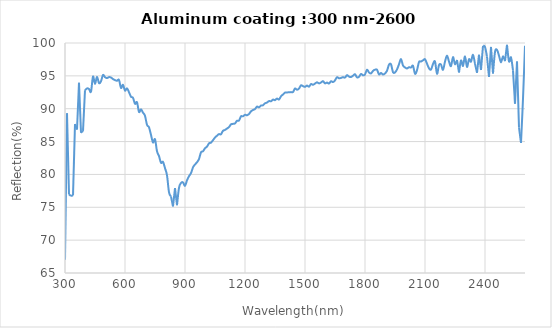
| Category | Reflection(%) |
|---|---|
| 2600.0 | 99.563 |
| 2590.0 | 91.52 |
| 2580.0 | 84.785 |
| 2570.0 | 87.147 |
| 2560.0 | 97.187 |
| 2550.0 | 90.767 |
| 2540.0 | 95.826 |
| 2530.0 | 97.818 |
| 2520.0 | 97.189 |
| 2510.0 | 99.725 |
| 2500.0 | 97.246 |
| 2490.0 | 97.972 |
| 2480.0 | 97.061 |
| 2470.0 | 98.062 |
| 2460.0 | 98.961 |
| 2450.0 | 98.632 |
| 2440.0 | 95.357 |
| 2430.0 | 99.401 |
| 2420.0 | 94.836 |
| 2410.0 | 97.933 |
| 2400.0 | 99.411 |
| 2390.0 | 99.559 |
| 2380.0 | 95.885 |
| 2370.0 | 98.211 |
| 2360.0 | 95.468 |
| 2350.0 | 96.833 |
| 2340.0 | 98.203 |
| 2330.0 | 97.158 |
| 2320.0 | 97.538 |
| 2310.0 | 96.358 |
| 2300.0 | 97.957 |
| 2290.0 | 96.51 |
| 2280.0 | 97.332 |
| 2270.0 | 95.514 |
| 2260.0 | 97.411 |
| 2250.0 | 96.761 |
| 2240.0 | 97.857 |
| 2230.0 | 96.488 |
| 2220.0 | 97.174 |
| 2210.0 | 98.084 |
| 2200.0 | 97.159 |
| 2190.0 | 95.916 |
| 2180.0 | 96.714 |
| 2170.0 | 96.638 |
| 2160.0 | 95.314 |
| 2150.0 | 97.18 |
| 2140.0 | 96.797 |
| 2130.0 | 95.952 |
| 2120.0 | 96.15 |
| 2110.0 | 96.855 |
| 2100.0 | 97.532 |
| 2090.0 | 97.361 |
| 2080.0 | 97.179 |
| 2070.0 | 97.109 |
| 2060.0 | 95.863 |
| 2050.0 | 95.316 |
| 2040.0 | 96.529 |
| 2030.0 | 96.26 |
| 2020.0 | 96.314 |
| 2010.0 | 96.125 |
| 2000.0 | 96.282 |
| 1990.0 | 96.584 |
| 1980.0 | 97.558 |
| 1970.0 | 96.76 |
| 1960.0 | 95.974 |
| 1950.0 | 95.522 |
| 1940.0 | 95.562 |
| 1930.0 | 96.753 |
| 1920.0 | 96.704 |
| 1910.0 | 95.779 |
| 1900.0 | 95.364 |
| 1890.0 | 95.207 |
| 1880.0 | 95.444 |
| 1870.0 | 95.229 |
| 1860.0 | 95.933 |
| 1850.0 | 95.939 |
| 1840.0 | 95.753 |
| 1830.0 | 95.368 |
| 1820.0 | 95.519 |
| 1810.0 | 95.935 |
| 1800.0 | 95.219 |
| 1790.0 | 95.076 |
| 1780.0 | 95.291 |
| 1770.0 | 94.85 |
| 1760.0 | 94.77 |
| 1750.0 | 95.243 |
| 1740.0 | 95.027 |
| 1730.0 | 94.82 |
| 1720.0 | 94.89 |
| 1710.0 | 95.11 |
| 1700.0 | 94.734 |
| 1690.0 | 94.801 |
| 1680.0 | 94.686 |
| 1670.0 | 94.632 |
| 1660.0 | 94.795 |
| 1650.0 | 94.311 |
| 1640.0 | 94.046 |
| 1630.0 | 94.181 |
| 1620.0 | 93.827 |
| 1610.0 | 93.98 |
| 1600.0 | 93.854 |
| 1590.0 | 94.197 |
| 1580.0 | 93.985 |
| 1570.0 | 93.853 |
| 1560.0 | 94.02 |
| 1550.0 | 93.824 |
| 1540.0 | 93.644 |
| 1530.0 | 93.753 |
| 1520.0 | 93.356 |
| 1510.0 | 93.525 |
| 1500.0 | 93.328 |
| 1490.0 | 93.431 |
| 1480.0 | 93.557 |
| 1470.0 | 93.06 |
| 1460.0 | 92.89 |
| 1450.0 | 93.077 |
| 1440.0 | 92.538 |
| 1430.0 | 92.526 |
| 1420.0 | 92.502 |
| 1410.0 | 92.478 |
| 1400.0 | 92.452 |
| 1390.0 | 92.168 |
| 1380.0 | 91.889 |
| 1370.0 | 91.402 |
| 1360.0 | 91.546 |
| 1350.0 | 91.296 |
| 1340.0 | 91.389 |
| 1330.0 | 91.133 |
| 1320.0 | 91.163 |
| 1310.0 | 90.937 |
| 1300.0 | 90.822 |
| 1290.0 | 90.527 |
| 1280.0 | 90.487 |
| 1270.0 | 90.205 |
| 1260.0 | 90.322 |
| 1250.0 | 89.949 |
| 1240.0 | 89.807 |
| 1230.0 | 89.601 |
| 1220.0 | 89.2 |
| 1210.0 | 89.001 |
| 1200.0 | 89.072 |
| 1190.0 | 88.84 |
| 1180.0 | 88.843 |
| 1170.0 | 88.2 |
| 1160.0 | 88.166 |
| 1150.0 | 87.763 |
| 1140.0 | 87.698 |
| 1130.0 | 87.618 |
| 1120.0 | 87.204 |
| 1110.0 | 86.987 |
| 1100.0 | 86.768 |
| 1090.0 | 86.639 |
| 1080.0 | 86.11 |
| 1070.0 | 86.136 |
| 1060.0 | 85.89 |
| 1050.0 | 85.614 |
| 1040.0 | 85.218 |
| 1030.0 | 84.838 |
| 1020.0 | 84.732 |
| 1010.0 | 84.233 |
| 1000.0 | 83.982 |
| 990.0 | 83.522 |
| 980.0 | 83.378 |
| 970.0 | 82.343 |
| 960.0 | 81.853 |
| 950.0 | 81.51 |
| 940.0 | 81.078 |
| 930.0 | 80.197 |
| 920.0 | 79.733 |
| 910.0 | 79.102 |
| 900.0 | 78.262 |
| 890.0 | 78.784 |
| 880.0 | 78.701 |
| 870.0 | 77.96 |
| 860.0 | 75.315 |
| 850.0 | 77.917 |
| 840.0 | 75.136 |
| 830.0 | 76.635 |
| 820.0 | 77.289 |
| 810.0 | 79.865 |
| 800.0 | 80.956 |
| 790.0 | 81.91 |
| 780.0 | 81.764 |
| 770.0 | 82.795 |
| 760.0 | 83.529 |
| 750.0 | 85.349 |
| 740.0 | 84.869 |
| 730.0 | 86.009 |
| 720.0 | 87.169 |
| 710.0 | 87.542 |
| 700.0 | 88.927 |
| 690.0 | 89.396 |
| 680.0 | 89.911 |
| 670.0 | 89.507 |
| 660.0 | 90.99 |
| 650.0 | 90.743 |
| 640.0 | 91.652 |
| 630.0 | 91.828 |
| 620.0 | 92.506 |
| 610.0 | 93.104 |
| 600.0 | 92.755 |
| 590.0 | 93.634 |
| 580.0 | 93.155 |
| 570.0 | 94.38 |
| 560.0 | 94.255 |
| 550.0 | 94.352 |
| 540.0 | 94.508 |
| 530.0 | 94.746 |
| 520.0 | 94.81 |
| 510.0 | 94.658 |
| 500.0 | 94.8 |
| 490.0 | 95.132 |
| 480.0 | 94.188 |
| 470.0 | 93.893 |
| 460.0 | 94.855 |
| 450.0 | 93.772 |
| 440.0 | 94.893 |
| 430.0 | 92.6 |
| 420.0 | 92.998 |
| 410.0 | 93.09 |
| 400.0 | 92.802 |
| 390.0 | 86.63 |
| 380.0 | 86.334 |
| 370.0 | 93.939 |
| 360.0 | 86.83 |
| 350.0 | 87.659 |
| 340.0 | 76.815 |
| 330.0 | 76.725 |
| 320.0 | 76.95 |
| 310.0 | 89.293 |
| 300.0 | 67.01 |